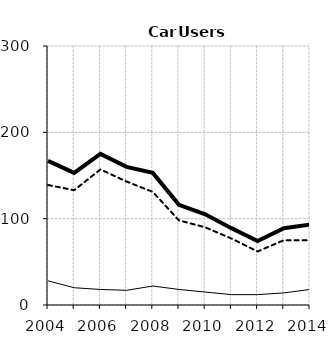
| Category | Built-up | Non built-up | Total |
|---|---|---|---|
| 2004.0 | 28 | 139 | 167 |
| 2005.0 | 20 | 133 | 153 |
| 2006.0 | 18 | 157 | 175 |
| 2007.0 | 17 | 143 | 160 |
| 2008.0 | 22 | 131 | 153 |
| 2009.0 | 18 | 98 | 116 |
| 2010.0 | 15 | 90 | 105 |
| 2011.0 | 12 | 77 | 89 |
| 2012.0 | 12 | 62 | 74 |
| 2013.0 | 14 | 75 | 89 |
| 2014.0 | 18 | 75 | 93 |